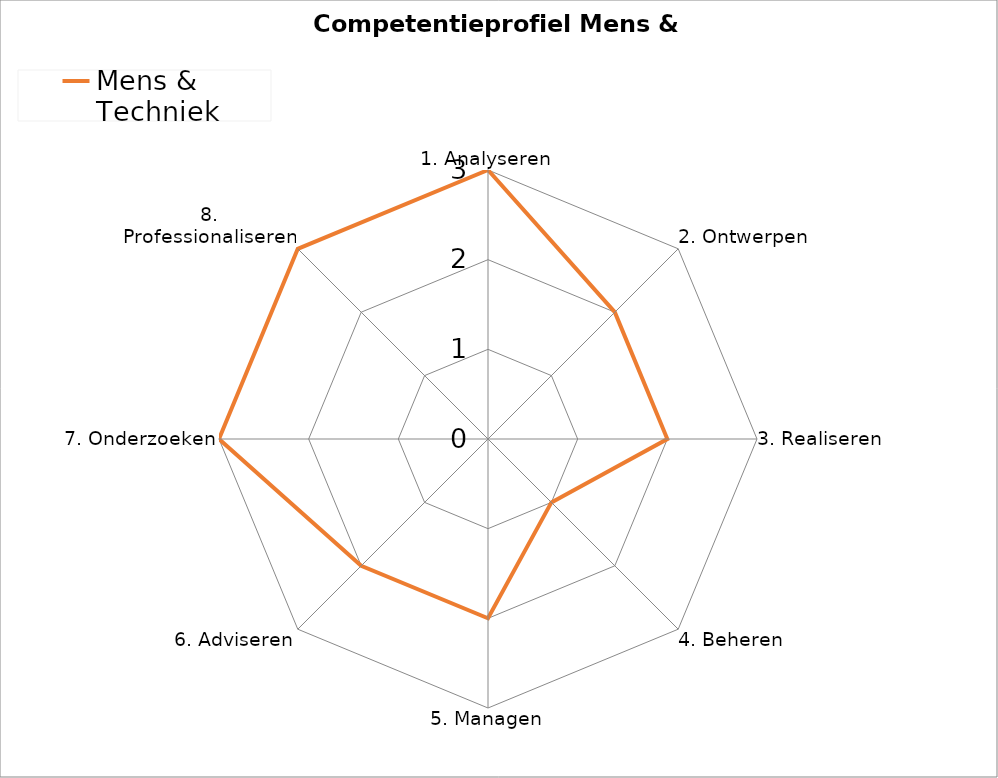
| Category | Mens & Techniek |
|---|---|
| 1. Analyseren | 3 |
| 2. Ontwerpen | 2 |
| 3. Realiseren | 2 |
| 4. Beheren | 1 |
| 5. Managen | 2 |
| 6. Adviseren | 2 |
| 7. Onderzoeken | 3 |
| 8. Professionaliseren | 3 |